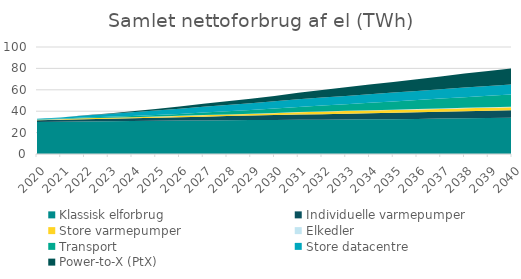
| Category | Klassisk elforbrug | Individuelle varmepumper | Store varmepumper | Elkedler | Transport | Store datacentre | Power-to-X (PtX) |
|---|---|---|---|---|---|---|---|
| 2020.0 | 29.797 | 1.723 | 0.273 | 0.147 | 0.626 | 0.377 | 0 |
| 2021.0 | 30.06 | 1.924 | 0.527 | 0.089 | 0.682 | 0.927 | 0 |
| 2022.0 | 30.324 | 2.126 | 0.869 | 0.083 | 0.761 | 1.736 | 0.25 |
| 2023.0 | 30.587 | 2.327 | 0.914 | 0.105 | 0.878 | 2.513 | 0.5 |
| 2024.0 | 30.85 | 2.528 | 0.976 | 0.102 | 1.142 | 3.505 | 0.75 |
| 2025.0 | 31.114 | 2.73 | 1.048 | 0.093 | 1.361 | 4.35 | 1.25 |
| 2026.0 | 31.256 | 3.113 | 1.21 | 0.12 | 1.645 | 4.947 | 2 |
| 2027.0 | 31.398 | 3.497 | 1.288 | 0.159 | 2.433 | 5.435 | 2.75 |
| 2028.0 | 31.54 | 3.881 | 1.415 | 0.153 | 2.901 | 5.898 | 3.5 |
| 2029.0 | 31.682 | 4.265 | 1.476 | 0.215 | 3.456 | 6.379 | 4.25 |
| 2030.0 | 31.824 | 4.648 | 1.647 | 0.242 | 4.076 | 6.817 | 5 |
| 2031.0 | 31.963 | 4.906 | 2.162 | 0.23 | 4.753 | 7.212 | 6 |
| 2032.0 | 32.102 | 5.163 | 2.267 | 0.266 | 5.46 | 7.517 | 7 |
| 2033.0 | 32.241 | 5.42 | 2.436 | 0.287 | 6.196 | 7.742 | 8 |
| 2034.0 | 32.38 | 5.678 | 2.532 | 0.319 | 6.957 | 7.997 | 9 |
| 2035.0 | 32.519 | 5.935 | 2.563 | 0.352 | 7.74 | 8.253 | 10 |
| 2036.0 | 32.791 | 6.145 | 2.623 | 0.386 | 8.519 | 8.508 | 11 |
| 2037.0 | 33.064 | 6.356 | 2.65 | 0.428 | 9.27 | 8.764 | 12 |
| 2038.0 | 33.337 | 6.566 | 2.77 | 0.489 | 9.989 | 9.019 | 13 |
| 2039.0 | 33.609 | 6.777 | 2.78 | 0.546 | 10.671 | 9.275 | 14 |
| 2040.0 | 33.882 | 6.987 | 2.826 | 0.563 | 11.313 | 9.53 | 15 |